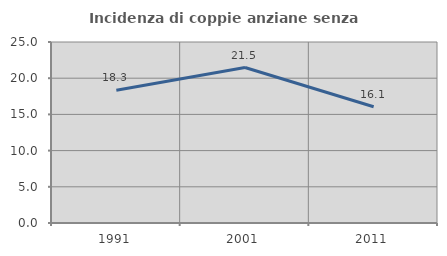
| Category | Incidenza di coppie anziane senza figli  |
|---|---|
| 1991.0 | 18.343 |
| 2001.0 | 21.477 |
| 2011.0 | 16.056 |